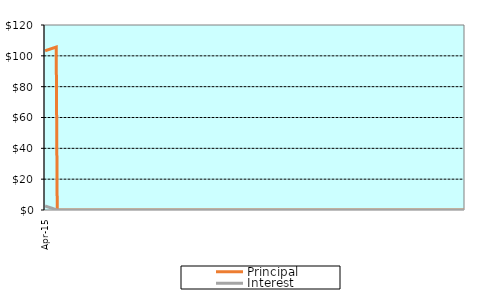
| Category | Principal | Interest |
|---|---|---|
| 42095 | 103.31 | 2.61 |
| 42125 | 103.35 | 2.57 |
| 42156 | 103.39 | 2.53 |
| 42186 | 103.43 | 2.49 |
| 42217 | 103.48 | 2.44 |
| 42248 | 103.52 | 2.4 |
| 42278 | 103.56 | 2.36 |
| 42309 | 103.61 | 2.31 |
| 42339 | 103.65 | 2.27 |
| 42370 | 103.69 | 2.23 |
| 42401 | 103.74 | 2.18 |
| 42430 | 103.78 | 2.14 |
| 42461 | 103.82 | 2.1 |
| 42491 | 103.87 | 2.05 |
| 42522 | 103.91 | 2.01 |
| 42552 | 103.95 | 1.97 |
| 42583 | 104 | 1.92 |
| 42614 | 104.04 | 1.88 |
| 42644 | 104.08 | 1.84 |
| 42675 | 104.13 | 1.79 |
| 42705 | 104.17 | 1.75 |
| 42736 | 104.21 | 1.71 |
| 42767 | 104.26 | 1.66 |
| 42795 | 104.3 | 1.62 |
| 42826 | 104.34 | 1.58 |
| 42856 | 104.39 | 1.53 |
| 42887 | 104.43 | 1.49 |
| 42917 | 104.47 | 1.45 |
| 42948 | 104.52 | 1.4 |
| 42979 | 104.56 | 1.36 |
| 43009 | 104.6 | 1.32 |
| 43040 | 104.65 | 1.27 |
| 43070 | 104.69 | 1.23 |
| 43101 | 104.74 | 1.18 |
| 43132 | 104.78 | 1.14 |
| 43160 | 104.82 | 1.1 |
| 43191 | 104.87 | 1.05 |
| 43221 | 104.91 | 1.01 |
| 43252 | 104.95 | 0.97 |
| 43282 | 105 | 0.92 |
| 43313 | 105.04 | 0.88 |
| 43344 | 105.09 | 0.83 |
| 43374 | 105.13 | 0.79 |
| 43405 | 105.17 | 0.75 |
| 43435 | 105.22 | 0.7 |
| 43466 | 105.26 | 0.66 |
| 43497 | 105.3 | 0.62 |
| 43525 | 105.35 | 0.57 |
| 43556 | 105.39 | 0.53 |
| 43586 | 105.44 | 0.48 |
| 43617 | 105.48 | 0.44 |
| 43647 | 105.52 | 0.4 |
| 43678 | 105.57 | 0.35 |
| 43709 | 105.61 | 0.31 |
| 43739 | 105.66 | 0.26 |
| 43770 | 105.7 | 0.22 |
| 43800 | 105.74 | 0.18 |
| 43831 | 105.79 | 0.13 |
| 43862 | 105.83 | 0.09 |
| 43891 | 105.74 | 0.04 |
|  | 0 | 0 |
|  | 0 | 0 |
|  | 0 | 0 |
|  | 0 | 0 |
|  | 0 | 0 |
|  | 0 | 0 |
|  | 0 | 0 |
|  | 0 | 0 |
|  | 0 | 0 |
|  | 0 | 0 |
|  | 0 | 0 |
|  | 0 | 0 |
|  | 0 | 0 |
|  | 0 | 0 |
|  | 0 | 0 |
|  | 0 | 0 |
|  | 0 | 0 |
|  | 0 | 0 |
|  | 0 | 0 |
|  | 0 | 0 |
|  | 0 | 0 |
|  | 0 | 0 |
|  | 0 | 0 |
|  | 0 | 0 |
|  | 0 | 0 |
|  | 0 | 0 |
|  | 0 | 0 |
|  | 0 | 0 |
|  | 0 | 0 |
|  | 0 | 0 |
|  | 0 | 0 |
|  | 0 | 0 |
|  | 0 | 0 |
|  | 0 | 0 |
|  | 0 | 0 |
|  | 0 | 0 |
|  | 0 | 0 |
|  | 0 | 0 |
|  | 0 | 0 |
|  | 0 | 0 |
|  | 0 | 0 |
|  | 0 | 0 |
|  | 0 | 0 |
|  | 0 | 0 |
|  | 0 | 0 |
|  | 0 | 0 |
|  | 0 | 0 |
|  | 0 | 0 |
|  | 0 | 0 |
|  | 0 | 0 |
|  | 0 | 0 |
|  | 0 | 0 |
|  | 0 | 0 |
|  | 0 | 0 |
|  | 0 | 0 |
|  | 0 | 0 |
|  | 0 | 0 |
|  | 0 | 0 |
|  | 0 | 0 |
|  | 0 | 0 |
|  | 0 | 0 |
|  | 0 | 0 |
|  | 0 | 0 |
|  | 0 | 0 |
|  | 0 | 0 |
|  | 0 | 0 |
|  | 0 | 0 |
|  | 0 | 0 |
|  | 0 | 0 |
|  | 0 | 0 |
|  | 0 | 0 |
|  | 0 | 0 |
|  | 0 | 0 |
|  | 0 | 0 |
|  | 0 | 0 |
|  | 0 | 0 |
|  | 0 | 0 |
|  | 0 | 0 |
|  | 0 | 0 |
|  | 0 | 0 |
|  | 0 | 0 |
|  | 0 | 0 |
|  | 0 | 0 |
|  | 0 | 0 |
|  | 0 | 0 |
|  | 0 | 0 |
|  | 0 | 0 |
|  | 0 | 0 |
|  | 0 | 0 |
|  | 0 | 0 |
|  | 0 | 0 |
|  | 0 | 0 |
|  | 0 | 0 |
|  | 0 | 0 |
|  | 0 | 0 |
|  | 0 | 0 |
|  | 0 | 0 |
|  | 0 | 0 |
|  | 0 | 0 |
|  | 0 | 0 |
|  | 0 | 0 |
|  | 0 | 0 |
|  | 0 | 0 |
|  | 0 | 0 |
|  | 0 | 0 |
|  | 0 | 0 |
|  | 0 | 0 |
|  | 0 | 0 |
|  | 0 | 0 |
|  | 0 | 0 |
|  | 0 | 0 |
|  | 0 | 0 |
|  | 0 | 0 |
|  | 0 | 0 |
|  | 0 | 0 |
|  | 0 | 0 |
|  | 0 | 0 |
|  | 0 | 0 |
|  | 0 | 0 |
|  | 0 | 0 |
|  | 0 | 0 |
|  | 0 | 0 |
|  | 0 | 0 |
|  | 0 | 0 |
|  | 0 | 0 |
|  | 0 | 0 |
|  | 0 | 0 |
|  | 0 | 0 |
|  | 0 | 0 |
|  | 0 | 0 |
|  | 0 | 0 |
|  | 0 | 0 |
|  | 0 | 0 |
|  | 0 | 0 |
|  | 0 | 0 |
|  | 0 | 0 |
|  | 0 | 0 |
|  | 0 | 0 |
|  | 0 | 0 |
|  | 0 | 0 |
|  | 0 | 0 |
|  | 0 | 0 |
|  | 0 | 0 |
|  | 0 | 0 |
|  | 0 | 0 |
|  | 0 | 0 |
|  | 0 | 0 |
|  | 0 | 0 |
|  | 0 | 0 |
|  | 0 | 0 |
|  | 0 | 0 |
|  | 0 | 0 |
|  | 0 | 0 |
|  | 0 | 0 |
|  | 0 | 0 |
|  | 0 | 0 |
|  | 0 | 0 |
|  | 0 | 0 |
|  | 0 | 0 |
|  | 0 | 0 |
|  | 0 | 0 |
|  | 0 | 0 |
|  | 0 | 0 |
|  | 0 | 0 |
|  | 0 | 0 |
|  | 0 | 0 |
|  | 0 | 0 |
|  | 0 | 0 |
|  | 0 | 0 |
|  | 0 | 0 |
|  | 0 | 0 |
|  | 0 | 0 |
|  | 0 | 0 |
|  | 0 | 0 |
|  | 0 | 0 |
|  | 0 | 0 |
|  | 0 | 0 |
|  | 0 | 0 |
|  | 0 | 0 |
|  | 0 | 0 |
|  | 0 | 0 |
|  | 0 | 0 |
|  | 0 | 0 |
|  | 0 | 0 |
|  | 0 | 0 |
|  | 0 | 0 |
|  | 0 | 0 |
|  | 0 | 0 |
|  | 0 | 0 |
|  | 0 | 0 |
|  | 0 | 0 |
|  | 0 | 0 |
|  | 0 | 0 |
|  | 0 | 0 |
|  | 0 | 0 |
|  | 0 | 0 |
|  | 0 | 0 |
|  | 0 | 0 |
|  | 0 | 0 |
|  | 0 | 0 |
|  | 0 | 0 |
|  | 0 | 0 |
|  | 0 | 0 |
|  | 0 | 0 |
|  | 0 | 0 |
|  | 0 | 0 |
|  | 0 | 0 |
|  | 0 | 0 |
|  | 0 | 0 |
|  | 0 | 0 |
|  | 0 | 0 |
|  | 0 | 0 |
|  | 0 | 0 |
|  | 0 | 0 |
|  | 0 | 0 |
|  | 0 | 0 |
|  | 0 | 0 |
|  | 0 | 0 |
|  | 0 | 0 |
|  | 0 | 0 |
|  | 0 | 0 |
|  | 0 | 0 |
|  | 0 | 0 |
|  | 0 | 0 |
|  | 0 | 0 |
|  | 0 | 0 |
|  | 0 | 0 |
|  | 0 | 0 |
|  | 0 | 0 |
|  | 0 | 0 |
|  | 0 | 0 |
|  | 0 | 0 |
|  | 0 | 0 |
|  | 0 | 0 |
|  | 0 | 0 |
|  | 0 | 0 |
|  | 0 | 0 |
|  | 0 | 0 |
|  | 0 | 0 |
|  | 0 | 0 |
|  | 0 | 0 |
|  | 0 | 0 |
|  | 0 | 0 |
|  | 0 | 0 |
|  | 0 | 0 |
|  | 0 | 0 |
|  | 0 | 0 |
|  | 0 | 0 |
|  | 0 | 0 |
|  | 0 | 0 |
|  | 0 | 0 |
|  | 0 | 0 |
|  | 0 | 0 |
|  | 0 | 0 |
|  | 0 | 0 |
|  | 0 | 0 |
|  | 0 | 0 |
|  | 0 | 0 |
|  | 0 | 0 |
|  | 0 | 0 |
|  | 0 | 0 |
|  | 0 | 0 |
|  | 0 | 0 |
|  | 0 | 0 |
|  | 0 | 0 |
|  | 0 | 0 |
|  | 0 | 0 |
|  | 0 | 0 |
|  | 0 | 0 |
|  | 0 | 0 |
|  | 0 | 0 |
|  | 0 | 0 |
|  | 0 | 0 |
|  | 0 | 0 |
|  | 0 | 0 |
|  | 0 | 0 |
|  | 0 | 0 |
|  | 0 | 0 |
|  | 0 | 0 |
|  | 0 | 0 |
|  | 0 | 0 |
|  | 0 | 0 |
|  | 0 | 0 |
|  | 0 | 0 |
|  | 0 | 0 |
|  | 0 | 0 |
|  | 0 | 0 |
|  | 0 | 0 |
|  | 0 | 0 |
|  | 0 | 0 |
|  | 0 | 0 |
|  | 0 | 0 |
|  | 0 | 0 |
|  | 0 | 0 |
|  | 0 | 0 |
|  | 0 | 0 |
|  | 0 | 0 |
|  | 0 | 0 |
|  | 0 | 0 |
|  | 0 | 0 |
|  | 0 | 0 |
|  | 0 | 0 |
|  | 0 | 0 |
|  | 0 | 0 |
|  | 0 | 0 |
|  | 0 | 0 |
|  | 0 | 0 |
|  | 0 | 0 |
|  | 0 | 0 |
|  | 0 | 0 |
|  | 0 | 0 |
|  | 0 | 0 |
|  | 0 | 0 |
|  | 0 | 0 |
|  | 0 | 0 |
|  | 0 | 0 |
|  | 0 | 0 |
|  | 0 | 0 |
|  | 0 | 0 |
|  | 0 | 0 |
|  | 0 | 0 |
|  | 0 | 0 |
|  | 0 | 0 |
|  | 0 | 0 |
|  | 0 | 0 |
|  | 0 | 0 |
|  | 0 | 0 |
|  | 0 | 0 |
|  | 0 | 0 |
|  | 0 | 0 |
|  | 0 | 0 |
|  | 0 | 0 |
|  | 0 | 0 |
|  | 0 | 0 |
|  | 0 | 0 |
|  | 0 | 0 |
|  | 0 | 0 |
|  | 0 | 0 |
|  | 0 | 0 |
|  | 0 | 0 |
|  | 0 | 0 |
|  | 0 | 0 |
|  | 0 | 0 |
|  | 0 | 0 |
|  | 0 | 0 |
|  | 0 | 0 |
|  | 0 | 0 |
|  | 0 | 0 |
|  | 0 | 0 |
|  | 0 | 0 |
|  | 0 | 0 |
|  | 0 | 0 |
|  | 0 | 0 |
|  | 0 | 0 |
|  | 0 | 0 |
|  | 0 | 0 |
|  | 0 | 0 |
|  | 0 | 0 |
|  | 0 | 0 |
|  | 0 | 0 |
|  | 0 | 0 |
|  | 0 | 0 |
|  | 0 | 0 |
|  | 0 | 0 |
|  | 0 | 0 |
|  | 0 | 0 |
|  | 0 | 0 |
|  | 0 | 0 |
|  | 0 | 0 |
|  | 0 | 0 |
|  | 0 | 0 |
|  | 0 | 0 |
|  | 0 | 0 |
|  | 0 | 0 |
|  | 0 | 0 |
|  | 0 | 0 |
|  | 0 | 0 |
|  | 0 | 0 |
|  | 0 | 0 |
|  | 0 | 0 |
|  | 0 | 0 |
|  | 0 | 0 |
|  | 0 | 0 |
|  | 0 | 0 |
|  | 0 | 0 |
|  | 0 | 0 |
|  | 0 | 0 |
|  | 0 | 0 |
|  | 0 | 0 |
|  | 0 | 0 |
|  | 0 | 0 |
|  | 0 | 0 |
|  | 0 | 0 |
|  | 0 | 0 |
|  | 0 | 0 |
|  | 0 | 0 |
|  | 0 | 0 |
|  | 0 | 0 |
|  | 0 | 0 |
|  | 0 | 0 |
|  | 0 | 0 |
|  | 0 | 0 |
|  | 0 | 0 |
|  | 0 | 0 |
|  | 0 | 0 |
|  | 0 | 0 |
|  | 0 | 0 |
|  | 0 | 0 |
|  | 0 | 0 |
|  | 0 | 0 |
|  | 0 | 0 |
|  | 0 | 0 |
|  | 0 | 0 |
|  | 0 | 0 |
|  | 0 | 0 |
|  | 0 | 0 |
|  | 0 | 0 |
|  | 0 | 0 |
|  | 0 | 0 |
|  | 0 | 0 |
|  | 0 | 0 |
|  | 0 | 0 |
|  | 0 | 0 |
|  | 0 | 0 |
|  | 0 | 0 |
|  | 0 | 0 |
|  | 0 | 0 |
|  | 0 | 0 |
|  | 0 | 0 |
|  | 0 | 0 |
|  | 0 | 0 |
|  | 0 | 0 |
|  | 0 | 0 |
|  | 0 | 0 |
|  | 0 | 0 |
|  | 0 | 0 |
|  | 0 | 0 |
|  | 0 | 0 |
|  | 0 | 0 |
|  | 0 | 0 |
|  | 0 | 0 |
|  | 0 | 0 |
|  | 0 | 0 |
|  | 0 | 0 |
|  | 0 | 0 |
|  | 0 | 0 |
|  | 0 | 0 |
|  | 0 | 0 |
|  | 0 | 0 |
|  | 0 | 0 |
|  | 0 | 0 |
|  | 0 | 0 |
|  | 0 | 0 |
|  | 0 | 0 |
|  | 0 | 0 |
|  | 0 | 0 |
|  | 0 | 0 |
|  | 0 | 0 |
|  | 0 | 0 |
|  | 0 | 0 |
|  | 0 | 0 |
|  | 0 | 0 |
|  | 0 | 0 |
|  | 0 | 0 |
|  | 0 | 0 |
|  | 0 | 0 |
|  | 0 | 0 |
|  | 0 | 0 |
|  | 0 | 0 |
|  | 0 | 0 |
|  | 0 | 0 |
|  | 0 | 0 |
|  | 0 | 0 |
|  | 0 | 0 |
|  | 0 | 0 |
|  | 0 | 0 |
|  | 0 | 0 |
|  | 0 | 0 |
|  | 0 | 0 |
|  | 0 | 0 |
|  | 0 | 0 |
|  | 0 | 0 |
|  | 0 | 0 |
|  | 0 | 0 |
|  | 0 | 0 |
|  | 0 | 0 |
|  | 0 | 0 |
|  | 0 | 0 |
|  | 0 | 0 |
|  | 0 | 0 |
|  | 0 | 0 |
|  | 0 | 0 |
|  | 0 | 0 |
|  | 0 | 0 |
|  | 0 | 0 |
|  | 0 | 0 |
|  | 0 | 0 |
|  | 0 | 0 |
|  | 0 | 0 |
|  | 0 | 0 |
|  | 0 | 0 |
|  | 0 | 0 |
|  | 0 | 0 |
|  | 0 | 0 |
|  | 0 | 0 |
|  | 0 | 0 |
|  | 0 | 0 |
|  | 0 | 0 |
|  | 0 | 0 |
|  | 0 | 0 |
|  | 0 | 0 |
|  | 0 | 0 |
|  | 0 | 0 |
|  | 0 | 0 |
|  | 0 | 0 |
|  | 0 | 0 |
|  | 0 | 0 |
|  | 0 | 0 |
|  | 0 | 0 |
|  | 0 | 0 |
|  | 0 | 0 |
|  | 0 | 0 |
|  | 0 | 0 |
|  | 0 | 0 |
|  | 0 | 0 |
|  | 0 | 0 |
|  | 0 | 0 |
|  | 0 | 0 |
|  | 0 | 0 |
|  | 0 | 0 |
|  | 0 | 0 |
|  | 0 | 0 |
|  | 0 | 0 |
|  | 0 | 0 |
|  | 0 | 0 |
|  | 0 | 0 |
|  | 0 | 0 |
|  | 0 | 0 |
|  | 0 | 0 |
|  | 0 | 0 |
|  | 0 | 0 |
|  | 0 | 0 |
|  | 0 | 0 |
|  | 0 | 0 |
|  | 0 | 0 |
|  | 0 | 0 |
|  | 0 | 0 |
|  | 0 | 0 |
|  | 0 | 0 |
|  | 0 | 0 |
|  | 0 | 0 |
|  | 0 | 0 |
|  | 0 | 0 |
|  | 0 | 0 |
|  | 0 | 0 |
|  | 0 | 0 |
|  | 0 | 0 |
|  | 0 | 0 |
|  | 0 | 0 |
|  | 0 | 0 |
|  | 0 | 0 |
|  | 0 | 0 |
|  | 0 | 0 |
|  | 0 | 0 |
|  | 0 | 0 |
|  | 0 | 0 |
|  | 0 | 0 |
|  | 0 | 0 |
|  | 0 | 0 |
|  | 0 | 0 |
|  | 0 | 0 |
|  | 0 | 0 |
|  | 0 | 0 |
|  | 0 | 0 |
|  | 0 | 0 |
|  | 0 | 0 |
|  | 0 | 0 |
|  | 0 | 0 |
|  | 0 | 0 |
|  | 0 | 0 |
|  | 0 | 0 |
|  | 0 | 0 |
|  | 0 | 0 |
|  | 0 | 0 |
|  | 0 | 0 |
|  | 0 | 0 |
|  | 0 | 0 |
|  | 0 | 0 |
|  | 0 | 0 |
|  | 0 | 0 |
|  | 0 | 0 |
|  | 0 | 0 |
|  | 0 | 0 |
|  | 0 | 0 |
|  | 0 | 0 |
|  | 0 | 0 |
|  | 0 | 0 |
|  | 0 | 0 |
|  | 0 | 0 |
|  | 0 | 0 |
|  | 0 | 0 |
|  | 0 | 0 |
|  | 0 | 0 |
|  | 0 | 0 |
|  | 0 | 0 |
|  | 0 | 0 |
|  | 0 | 0 |
|  | 0 | 0 |
|  | 0 | 0 |
|  | 0 | 0 |
|  | 0 | 0 |
|  | 0 | 0 |
|  | 0 | 0 |
|  | 0 | 0 |
|  | 0 | 0 |
|  | 0 | 0 |
|  | 0 | 0 |
|  | 0 | 0 |
|  | 0 | 0 |
|  | 0 | 0 |
|  | 0 | 0 |
|  | 0 | 0 |
|  | 0 | 0 |
|  | 0 | 0 |
|  | 0 | 0 |
|  | 0 | 0 |
|  | 0 | 0 |
|  | 0 | 0 |
|  | 0 | 0 |
|  | 0 | 0 |
|  | 0 | 0 |
|  | 0 | 0 |
|  | 0 | 0 |
|  | 0 | 0 |
|  | 0 | 0 |
|  | 0 | 0 |
|  | 0 | 0 |
|  | 0 | 0 |
|  | 0 | 0 |
|  | 0 | 0 |
|  | 0 | 0 |
|  | 0 | 0 |
|  | 0 | 0 |
|  | 0 | 0 |
|  | 0 | 0 |
|  | 0 | 0 |
|  | 0 | 0 |
|  | 0 | 0 |
|  | 0 | 0 |
|  | 0 | 0 |
|  | 0 | 0 |
|  | 0 | 0 |
|  | 0 | 0 |
|  | 0 | 0 |
|  | 0 | 0 |
|  | 0 | 0 |
|  | 0 | 0 |
|  | 0 | 0 |
|  | 0 | 0 |
|  | 0 | 0 |
|  | 0 | 0 |
|  | 0 | 0 |
|  | 0 | 0 |
|  | 0 | 0 |
|  | 0 | 0 |
|  | 0 | 0 |
|  | 0 | 0 |
|  | 0 | 0 |
|  | 0 | 0 |
|  | 0 | 0 |
|  | 0 | 0 |
|  | 0 | 0 |
|  | 0 | 0 |
|  | 0 | 0 |
|  | 0 | 0 |
|  | 0 | 0 |
|  | 0 | 0 |
|  | 0 | 0 |
|  | 0 | 0 |
|  | 0 | 0 |
|  | 0 | 0 |
|  | 0 | 0 |
|  | 0 | 0 |
|  | 0 | 0 |
|  | 0 | 0 |
|  | 0 | 0 |
|  | 0 | 0 |
|  | 0 | 0 |
|  | 0 | 0 |
|  | 0 | 0 |
|  | 0 | 0 |
|  | 0 | 0 |
|  | 0 | 0 |
|  | 0 | 0 |
|  | 0 | 0 |
|  | 0 | 0 |
|  | 0 | 0 |
|  | 0 | 0 |
|  | 0 | 0 |
|  | 0 | 0 |
|  | 0 | 0 |
|  | 0 | 0 |
|  | 0 | 0 |
|  | 0 | 0 |
|  | 0 | 0 |
|  | 0 | 0 |
|  | 0 | 0 |
|  | 0 | 0 |
|  | 0 | 0 |
|  | 0 | 0 |
|  | 0 | 0 |
|  | 0 | 0 |
|  | 0 | 0 |
|  | 0 | 0 |
|  | 0 | 0 |
|  | 0 | 0 |
|  | 0 | 0 |
|  | 0 | 0 |
|  | 0 | 0 |
|  | 0 | 0 |
|  | 0 | 0 |
|  | 0 | 0 |
|  | 0 | 0 |
|  | 0 | 0 |
|  | 0 | 0 |
|  | 0 | 0 |
|  | 0 | 0 |
|  | 0 | 0 |
|  | 0 | 0 |
|  | 0 | 0 |
|  | 0 | 0 |
|  | 0 | 0 |
|  | 0 | 0 |
|  | 0 | 0 |
|  | 0 | 0 |
|  | 0 | 0 |
|  | 0 | 0 |
|  | 0 | 0 |
|  | 0 | 0 |
|  | 0 | 0 |
|  | 0 | 0 |
|  | 0 | 0 |
|  | 0 | 0 |
|  | 0 | 0 |
|  | 0 | 0 |
|  | 0 | 0 |
|  | 0 | 0 |
|  | 0 | 0 |
|  | 0 | 0 |
|  | 0 | 0 |
|  | 0 | 0 |
|  | 0 | 0 |
|  | 0 | 0 |
|  | 0 | 0 |
|  | 0 | 0 |
|  | 0 | 0 |
|  | 0 | 0 |
|  | 0 | 0 |
|  | 0 | 0 |
|  | 0 | 0 |
|  | 0 | 0 |
|  | 0 | 0 |
|  | 0 | 0 |
|  | 0 | 0 |
|  | 0 | 0 |
|  | 0 | 0 |
|  | 0 | 0 |
|  | 0 | 0 |
|  | 0 | 0 |
|  | 0 | 0 |
|  | 0 | 0 |
|  | 0 | 0 |
|  | 0 | 0 |
|  | 0 | 0 |
|  | 0 | 0 |
|  | 0 | 0 |
|  | 0 | 0 |
|  | 0 | 0 |
|  | 0 | 0 |
|  | 0 | 0 |
|  | 0 | 0 |
|  | 0 | 0 |
|  | 0 | 0 |
|  | 0 | 0 |
|  | 0 | 0 |
|  | 0 | 0 |
|  | 0 | 0 |
|  | 0 | 0 |
|  | 0 | 0 |
|  | 0 | 0 |
|  | 0 | 0 |
|  | 0 | 0 |
|  | 0 | 0 |
|  | 0 | 0 |
|  | 0 | 0 |
|  | 0 | 0 |
|  | 0 | 0 |
|  | 0 | 0 |
|  | 0 | 0 |
|  | 0 | 0 |
|  | 0 | 0 |
|  | 0 | 0 |
|  | 0 | 0 |
|  | 0 | 0 |
|  | 0 | 0 |
|  | 0 | 0 |
|  | 0 | 0 |
|  | 0 | 0 |
|  | 0 | 0 |
|  | 0 | 0 |
|  | 0 | 0 |
|  | 0 | 0 |
|  | 0 | 0 |
|  | 0 | 0 |
|  | 0 | 0 |
|  | 0 | 0 |
|  | 0 | 0 |
|  | 0 | 0 |
|  | 0 | 0 |
|  | 0 | 0 |
|  | 0 | 0 |
|  | 0 | 0 |
|  | 0 | 0 |
|  | 0 | 0 |
|  | 0 | 0 |
|  | 0 | 0 |
|  | 0 | 0 |
|  | 0 | 0 |
|  | 0 | 0 |
|  | 0 | 0 |
|  | 0 | 0 |
|  | 0 | 0 |
|  | 0 | 0 |
|  | 0 | 0 |
|  | 0 | 0 |
|  | 0 | 0 |
|  | 0 | 0 |
|  | 0 | 0 |
|  | 0 | 0 |
|  | 0 | 0 |
|  | 0 | 0 |
|  | 0 | 0 |
|  | 0 | 0 |
|  | 0 | 0 |
|  | 0 | 0 |
|  | 0 | 0 |
|  | 0 | 0 |
|  | 0 | 0 |
|  | 0 | 0 |
|  | 0 | 0 |
|  | 0 | 0 |
|  | 0 | 0 |
|  | 0 | 0 |
|  | 0 | 0 |
|  | 0 | 0 |
|  | 0 | 0 |
|  | 0 | 0 |
|  | 0 | 0 |
|  | 0 | 0 |
|  | 0 | 0 |
|  | 0 | 0 |
|  | 0 | 0 |
|  | 0 | 0 |
|  | 0 | 0 |
|  | 0 | 0 |
|  | 0 | 0 |
|  | 0 | 0 |
|  | 0 | 0 |
|  | 0 | 0 |
|  | 0 | 0 |
|  | 0 | 0 |
|  | 0 | 0 |
|  | 0 | 0 |
|  | 0 | 0 |
|  | 0 | 0 |
|  | 0 | 0 |
|  | 0 | 0 |
|  | 0 | 0 |
|  | 0 | 0 |
|  | 0 | 0 |
|  | 0 | 0 |
|  | 0 | 0 |
|  | 0 | 0 |
|  | 0 | 0 |
|  | 0 | 0 |
|  | 0 | 0 |
|  | 0 | 0 |
|  | 0 | 0 |
|  | 0 | 0 |
|  | 0 | 0 |
|  | 0 | 0 |
|  | 0 | 0 |
|  | 0 | 0 |
|  | 0 | 0 |
|  | 0 | 0 |
|  | 0 | 0 |
|  | 0 | 0 |
|  | 0 | 0 |
|  | 0 | 0 |
|  | 0 | 0 |
|  | 0 | 0 |
|  | 0 | 0 |
|  | 0 | 0 |
|  | 0 | 0 |
|  | 0 | 0 |
|  | 0 | 0 |
|  | 0 | 0 |
|  | 0 | 0 |
|  | 0 | 0 |
|  | 0 | 0 |
|  | 0 | 0 |
|  | 0 | 0 |
|  | 0 | 0 |
|  | 0 | 0 |
|  | 0 | 0 |
|  | 0 | 0 |
|  | 0 | 0 |
|  | 0 | 0 |
|  | 0 | 0 |
|  | 0 | 0 |
|  | 0 | 0 |
|  | 0 | 0 |
|  | 0 | 0 |
|  | 0 | 0 |
|  | 0 | 0 |
|  | 0 | 0 |
|  | 0 | 0 |
|  | 0 | 0 |
|  | 0 | 0 |
|  | 0 | 0 |
|  | 0 | 0 |
|  | 0 | 0 |
|  | 0 | 0 |
|  | 0 | 0 |
|  | 0 | 0 |
|  | 0 | 0 |
|  | 0 | 0 |
|  | 0 | 0 |
|  | 0 | 0 |
|  | 0 | 0 |
|  | 0 | 0 |
|  | 0 | 0 |
|  | 0 | 0 |
|  | 0 | 0 |
|  | 0 | 0 |
|  | 0 | 0 |
|  | 0 | 0 |
|  | 0 | 0 |
|  | 0 | 0 |
|  | 0 | 0 |
|  | 0 | 0 |
|  | 0 | 0 |
|  | 0 | 0 |
|  | 0 | 0 |
|  | 0 | 0 |
|  | 0 | 0 |
|  | 0 | 0 |
|  | 0 | 0 |
|  | 0 | 0 |
|  | 0 | 0 |
|  | 0 | 0 |
|  | 0 | 0 |
|  | 0 | 0 |
|  | 0 | 0 |
|  | 0 | 0 |
|  | 0 | 0 |
|  | 0 | 0 |
|  | 0 | 0 |
|  | 0 | 0 |
|  | 0 | 0 |
|  | 0 | 0 |
|  | 0 | 0 |
|  | 0 | 0 |
|  | 0 | 0 |
|  | 0 | 0 |
|  | 0 | 0 |
|  | 0 | 0 |
|  | 0 | 0 |
|  | 0 | 0 |
|  | 0 | 0 |
|  | 0 | 0 |
|  | 0 | 0 |
|  | 0 | 0 |
|  | 0 | 0 |
|  | 0 | 0 |
|  | 0 | 0 |
|  | 0 | 0 |
|  | 0 | 0 |
|  | 0 | 0 |
|  | 0 | 0 |
|  | 0 | 0 |
|  | 0 | 0 |
|  | 0 | 0 |
|  | 0 | 0 |
|  | 0 | 0 |
|  | 0 | 0 |
|  | 0 | 0 |
|  | 0 | 0 |
|  | 0 | 0 |
|  | 0 | 0 |
|  | 0 | 0 |
|  | 0 | 0 |
|  | 0 | 0 |
|  | 0 | 0 |
|  | 0 | 0 |
|  | 0 | 0 |
|  | 0 | 0 |
|  | 0 | 0 |
|  | 0 | 0 |
|  | 0 | 0 |
|  | 0 | 0 |
|  | 0 | 0 |
|  | 0 | 0 |
|  | 0 | 0 |
|  | 0 | 0 |
|  | 0 | 0 |
|  | 0 | 0 |
|  | 0 | 0 |
|  | 0 | 0 |
|  | 0 | 0 |
|  | 0 | 0 |
|  | 0 | 0 |
|  | 0 | 0 |
|  | 0 | 0 |
|  | 0 | 0 |
|  | 0 | 0 |
|  | 0 | 0 |
|  | 0 | 0 |
|  | 0 | 0 |
|  | 0 | 0 |
|  | 0 | 0 |
|  | 0 | 0 |
|  | 0 | 0 |
|  | 0 | 0 |
|  | 0 | 0 |
|  | 0 | 0 |
|  | 0 | 0 |
|  | 0 | 0 |
|  | 0 | 0 |
|  | 0 | 0 |
|  | 0 | 0 |
|  | 0 | 0 |
|  | 0 | 0 |
|  | 0 | 0 |
|  | 0 | 0 |
|  | 0 | 0 |
|  | 0 | 0 |
|  | 0 | 0 |
|  | 0 | 0 |
|  | 0 | 0 |
|  | 0 | 0 |
|  | 0 | 0 |
|  | 0 | 0 |
|  | 0 | 0 |
|  | 0 | 0 |
|  | 0 | 0 |
|  | 0 | 0 |
|  | 0 | 0 |
|  | 0 | 0 |
|  | 0 | 0 |
|  | 0 | 0 |
|  | 0 | 0 |
|  | 0 | 0 |
|  | 0 | 0 |
|  | 0 | 0 |
|  | 0 | 0 |
|  | 0 | 0 |
|  | 0 | 0 |
|  | 0 | 0 |
|  | 0 | 0 |
|  | 0 | 0 |
|  | 0 | 0 |
|  | 0 | 0 |
|  | 0 | 0 |
|  | 0 | 0 |
|  | 0 | 0 |
|  | 0 | 0 |
|  | 0 | 0 |
|  | 0 | 0 |
|  | 0 | 0 |
|  | 0 | 0 |
|  | 0 | 0 |
|  | 0 | 0 |
|  | 0 | 0 |
|  | 0 | 0 |
|  | 0 | 0 |
|  | 0 | 0 |
|  | 0 | 0 |
|  | 0 | 0 |
|  | 0 | 0 |
|  | 0 | 0 |
|  | 0 | 0 |
|  | 0 | 0 |
|  | 0 | 0 |
|  | 0 | 0 |
|  | 0 | 0 |
|  | 0 | 0 |
|  | 0 | 0 |
|  | 0 | 0 |
|  | 0 | 0 |
|  | 0 | 0 |
|  | 0 | 0 |
|  | 0 | 0 |
|  | 0 | 0 |
|  | 0 | 0 |
|  | 0 | 0 |
|  | 0 | 0 |
|  | 0 | 0 |
|  | 0 | 0 |
|  | 0 | 0 |
|  | 0 | 0 |
|  | 0 | 0 |
|  | 0 | 0 |
|  | 0 | 0 |
|  | 0 | 0 |
|  | 0 | 0 |
|  | 0 | 0 |
|  | 0 | 0 |
|  | 0 | 0 |
|  | 0 | 0 |
|  | 0 | 0 |
|  | 0 | 0 |
|  | 0 | 0 |
|  | 0 | 0 |
|  | 0 | 0 |
|  | 0 | 0 |
|  | 0 | 0 |
|  | 0 | 0 |
|  | 0 | 0 |
|  | 0 | 0 |
|  | 0 | 0 |
|  | 0 | 0 |
|  | 0 | 0 |
|  | 0 | 0 |
|  | 0 | 0 |
|  | 0 | 0 |
|  | 0 | 0 |
|  | 0 | 0 |
|  | 0 | 0 |
|  | 0 | 0 |
|  | 0 | 0 |
|  | 0 | 0 |
|  | 0 | 0 |
|  | 0 | 0 |
|  | 0 | 0 |
|  | 0 | 0 |
|  | 0 | 0 |
|  | 0 | 0 |
|  | 0 | 0 |
|  | 0 | 0 |
|  | 0 | 0 |
|  | 0 | 0 |
|  | 0 | 0 |
|  | 0 | 0 |
|  | 0 | 0 |
|  | 0 | 0 |
|  | 0 | 0 |
|  | 0 | 0 |
|  | 0 | 0 |
|  | 0 | 0 |
|  | 0 | 0 |
|  | 0 | 0 |
|  | 0 | 0 |
|  | 0 | 0 |
|  | 0 | 0 |
|  | 0 | 0 |
|  | 0 | 0 |
|  | 0 | 0 |
|  | 0 | 0 |
|  | 0 | 0 |
|  | 0 | 0 |
|  | 0 | 0 |
|  | 0 | 0 |
|  | 0 | 0 |
|  | 0 | 0 |
|  | 0 | 0 |
|  | 0 | 0 |
|  | 0 | 0 |
|  | 0 | 0 |
|  | 0 | 0 |
|  | 0 | 0 |
|  | 0 | 0 |
|  | 0 | 0 |
|  | 0 | 0 |
|  | 0 | 0 |
|  | 0 | 0 |
|  | 0 | 0 |
|  | 0 | 0 |
|  | 0 | 0 |
|  | 0 | 0 |
|  | 0 | 0 |
|  | 0 | 0 |
|  | 0 | 0 |
|  | 0 | 0 |
|  | 0 | 0 |
|  | 0 | 0 |
|  | 0 | 0 |
|  | 0 | 0 |
|  | 0 | 0 |
|  | 0 | 0 |
|  | 0 | 0 |
|  | 0 | 0 |
|  | 0 | 0 |
|  | 0 | 0 |
|  | 0 | 0 |
|  | 0 | 0 |
|  | 0 | 0 |
|  | 0 | 0 |
|  | 0 | 0 |
|  | 0 | 0 |
|  | 0 | 0 |
|  | 0 | 0 |
|  | 0 | 0 |
|  | 0 | 0 |
|  | 0 | 0 |
|  | 0 | 0 |
|  | 0 | 0 |
|  | 0 | 0 |
|  | 0 | 0 |
|  | 0 | 0 |
|  | 0 | 0 |
|  | 0 | 0 |
|  | 0 | 0 |
|  | 0 | 0 |
|  | 0 | 0 |
|  | 0 | 0 |
|  | 0 | 0 |
|  | 0 | 0 |
|  | 0 | 0 |
|  | 0 | 0 |
|  | 0 | 0 |
|  | 0 | 0 |
|  | 0 | 0 |
|  | 0 | 0 |
|  | 0 | 0 |
|  | 0 | 0 |
|  | 0 | 0 |
|  | 0 | 0 |
|  | 0 | 0 |
|  | 0 | 0 |
|  | 0 | 0 |
|  | 0 | 0 |
|  | 0 | 0 |
|  | 0 | 0 |
|  | 0 | 0 |
|  | 0 | 0 |
|  | 0 | 0 |
|  | 0 | 0 |
|  | 0 | 0 |
|  | 0 | 0 |
|  | 0 | 0 |
|  | 0 | 0 |
|  | 0 | 0 |
|  | 0 | 0 |
|  | 0 | 0 |
|  | 0 | 0 |
|  | 0 | 0 |
|  | 0 | 0 |
|  | 0 | 0 |
|  | 0 | 0 |
|  | 0 | 0 |
|  | 0 | 0 |
|  | 0 | 0 |
|  | 0 | 0 |
|  | 0 | 0 |
|  | 0 | 0 |
|  | 0 | 0 |
|  | 0 | 0 |
|  | 0 | 0 |
|  | 0 | 0 |
|  | 0 | 0 |
|  | 0 | 0 |
|  | 0 | 0 |
|  | 0 | 0 |
|  | 0 | 0 |
|  | 0 | 0 |
|  | 0 | 0 |
|  | 0 | 0 |
|  | 0 | 0 |
|  | 0 | 0 |
|  | 0 | 0 |
|  | 0 | 0 |
|  | 0 | 0 |
|  | 0 | 0 |
|  | 0 | 0 |
|  | 0 | 0 |
|  | 0 | 0 |
|  | 0 | 0 |
|  | 0 | 0 |
|  | 0 | 0 |
|  | 0 | 0 |
|  | 0 | 0 |
|  | 0 | 0 |
|  | 0 | 0 |
|  | 0 | 0 |
|  | 0 | 0 |
|  | 0 | 0 |
|  | 0 | 0 |
|  | 0 | 0 |
|  | 0 | 0 |
|  | 0 | 0 |
|  | 0 | 0 |
|  | 0 | 0 |
|  | 0 | 0 |
|  | 0 | 0 |
|  | 0 | 0 |
|  | 0 | 0 |
|  | 0 | 0 |
|  | 0 | 0 |
|  | 0 | 0 |
|  | 0 | 0 |
|  | 0 | 0 |
|  | 0 | 0 |
|  | 0 | 0 |
|  | 0 | 0 |
|  | 0 | 0 |
|  | 0 | 0 |
|  | 0 | 0 |
|  | 0 | 0 |
|  | 0 | 0 |
|  | 0 | 0 |
|  | 0 | 0 |
|  | 0 | 0 |
|  | 0 | 0 |
|  | 0 | 0 |
|  | 0 | 0 |
|  | 0 | 0 |
|  | 0 | 0 |
|  | 0 | 0 |
|  | 0 | 0 |
|  | 0 | 0 |
|  | 0 | 0 |
|  | 0 | 0 |
|  | 0 | 0 |
|  | 0 | 0 |
|  | 0 | 0 |
|  | 0 | 0 |
|  | 0 | 0 |
|  | 0 | 0 |
|  | 0 | 0 |
|  | 0 | 0 |
|  | 0 | 0 |
|  | 0 | 0 |
|  | 0 | 0 |
|  | 0 | 0 |
|  | 0 | 0 |
|  | 0 | 0 |
|  | 0 | 0 |
|  | 0 | 0 |
|  | 0 | 0 |
|  | 0 | 0 |
|  | 0 | 0 |
|  | 0 | 0 |
|  | 0 | 0 |
|  | 0 | 0 |
|  | 0 | 0 |
|  | 0 | 0 |
|  | 0 | 0 |
|  | 0 | 0 |
|  | 0 | 0 |
|  | 0 | 0 |
|  | 0 | 0 |
|  | 0 | 0 |
|  | 0 | 0 |
|  | 0 | 0 |
|  | 0 | 0 |
|  | 0 | 0 |
|  | 0 | 0 |
|  | 0 | 0 |
|  | 0 | 0 |
|  | 0 | 0 |
|  | 0 | 0 |
|  | 0 | 0 |
|  | 0 | 0 |
|  | 0 | 0 |
|  | 0 | 0 |
|  | 0 | 0 |
|  | 0 | 0 |
|  | 0 | 0 |
|  | 0 | 0 |
|  | 0 | 0 |
|  | 0 | 0 |
|  | 0 | 0 |
|  | 0 | 0 |
|  | 0 | 0 |
|  | 0 | 0 |
|  | 0 | 0 |
|  | 0 | 0 |
|  | 0 | 0 |
|  | 0 | 0 |
|  | 0 | 0 |
|  | 0 | 0 |
|  | 0 | 0 |
|  | 0 | 0 |
|  | 0 | 0 |
|  | 0 | 0 |
|  | 0 | 0 |
|  | 0 | 0 |
|  | 0 | 0 |
|  | 0 | 0 |
|  | 0 | 0 |
|  | 0 | 0 |
|  | 0 | 0 |
|  | 0 | 0 |
|  | 0 | 0 |
|  | 0 | 0 |
|  | 0 | 0 |
|  | 0 | 0 |
|  | 0 | 0 |
|  | 0 | 0 |
|  | 0 | 0 |
|  | 0 | 0 |
|  | 0 | 0 |
|  | 0 | 0 |
|  | 0 | 0 |
|  | 0 | 0 |
|  | 0 | 0 |
|  | 0 | 0 |
|  | 0 | 0 |
|  | 0 | 0 |
|  | 0 | 0 |
|  | 0 | 0 |
|  | 0 | 0 |
|  | 0 | 0 |
|  | 0 | 0 |
|  | 0 | 0 |
|  | 0 | 0 |
|  | 0 | 0 |
|  | 0 | 0 |
|  | 0 | 0 |
|  | 0 | 0 |
|  | 0 | 0 |
|  | 0 | 0 |
|  | 0 | 0 |
|  | 0 | 0 |
|  | 0 | 0 |
|  | 0 | 0 |
|  | 0 | 0 |
|  | 0 | 0 |
|  | 0 | 0 |
|  | 0 | 0 |
|  | 0 | 0 |
|  | 0 | 0 |
|  | 0 | 0 |
|  | 0 | 0 |
|  | 0 | 0 |
|  | 0 | 0 |
|  | 0 | 0 |
|  | 0 | 0 |
|  | 0 | 0 |
|  | 0 | 0 |
|  | 0 | 0 |
|  | 0 | 0 |
|  | 0 | 0 |
|  | 0 | 0 |
|  | 0 | 0 |
|  | 0 | 0 |
|  | 0 | 0 |
|  | 0 | 0 |
|  | 0 | 0 |
|  | 0 | 0 |
|  | 0 | 0 |
|  | 0 | 0 |
|  | 0 | 0 |
|  | 0 | 0 |
|  | 0 | 0 |
|  | 0 | 0 |
|  | 0 | 0 |
|  | 0 | 0 |
|  | 0 | 0 |
|  | 0 | 0 |
|  | 0 | 0 |
|  | 0 | 0 |
|  | 0 | 0 |
|  | 0 | 0 |
|  | 0 | 0 |
|  | 0 | 0 |
|  | 0 | 0 |
|  | 0 | 0 |
|  | 0 | 0 |
|  | 0 | 0 |
|  | 0 | 0 |
|  | 0 | 0 |
|  | 0 | 0 |
|  | 0 | 0 |
|  | 0 | 0 |
|  | 0 | 0 |
|  | 0 | 0 |
|  | 0 | 0 |
|  | 0 | 0 |
|  | 0 | 0 |
|  | 0 | 0 |
|  | 0 | 0 |
|  | 0 | 0 |
|  | 0 | 0 |
|  | 0 | 0 |
|  | 0 | 0 |
|  | 0 | 0 |
|  | 0 | 0 |
|  | 0 | 0 |
|  | 0 | 0 |
|  | 0 | 0 |
|  | 0 | 0 |
|  | 0 | 0 |
|  | 0 | 0 |
|  | 0 | 0 |
|  | 0 | 0 |
|  | 0 | 0 |
|  | 0 | 0 |
|  | 0 | 0 |
|  | 0 | 0 |
|  | 0 | 0 |
|  | 0 | 0 |
|  | 0 | 0 |
|  | 0 | 0 |
|  | 0 | 0 |
|  | 0 | 0 |
|  | 0 | 0 |
|  | 0 | 0 |
|  | 0 | 0 |
|  | 0 | 0 |
|  | 0 | 0 |
|  | 0 | 0 |
|  | 0 | 0 |
|  | 0 | 0 |
|  | 0 | 0 |
|  | 0 | 0 |
|  | 0 | 0 |
|  | 0 | 0 |
|  | 0 | 0 |
|  | 0 | 0 |
|  | 0 | 0 |
|  | 0 | 0 |
|  | 0 | 0 |
|  | 0 | 0 |
|  | 0 | 0 |
|  | 0 | 0 |
|  | 0 | 0 |
|  | 0 | 0 |
|  | 0 | 0 |
|  | 0 | 0 |
|  | 0 | 0 |
|  | 0 | 0 |
|  | 0 | 0 |
|  | 0 | 0 |
|  | 0 | 0 |
|  | 0 | 0 |
|  | 0 | 0 |
|  | 0 | 0 |
|  | 0 | 0 |
|  | 0 | 0 |
|  | 0 | 0 |
|  | 0 | 0 |
|  | 0 | 0 |
|  | 0 | 0 |
|  | 0 | 0 |
|  | 0 | 0 |
|  | 0 | 0 |
|  | 0 | 0 |
|  | 0 | 0 |
|  | 0 | 0 |
|  | 0 | 0 |
|  | 0 | 0 |
|  | 0 | 0 |
|  | 0 | 0 |
|  | 0 | 0 |
|  | 0 | 0 |
|  | 0 | 0 |
|  | 0 | 0 |
|  | 0 | 0 |
|  | 0 | 0 |
|  | 0 | 0 |
|  | 0 | 0 |
|  | 0 | 0 |
|  | 0 | 0 |
|  | 0 | 0 |
|  | 0 | 0 |
|  | 0 | 0 |
|  | 0 | 0 |
|  | 0 | 0 |
|  | 0 | 0 |
|  | 0 | 0 |
|  | 0 | 0 |
|  | 0 | 0 |
|  | 0 | 0 |
|  | 0 | 0 |
|  | 0 | 0 |
|  | 0 | 0 |
|  | 0 | 0 |
|  | 0 | 0 |
|  | 0 | 0 |
|  | 0 | 0 |
|  | 0 | 0 |
|  | 0 | 0 |
|  | 0 | 0 |
|  | 0 | 0 |
|  | 0 | 0 |
|  | 0 | 0 |
|  | 0 | 0 |
|  | 0 | 0 |
|  | 0 | 0 |
|  | 0 | 0 |
|  | 0 | 0 |
|  | 0 | 0 |
|  | 0 | 0 |
|  | 0 | 0 |
|  | 0 | 0 |
|  | 0 | 0 |
|  | 0 | 0 |
|  | 0 | 0 |
|  | 0 | 0 |
|  | 0 | 0 |
|  | 0 | 0 |
|  | 0 | 0 |
|  | 0 | 0 |
|  | 0 | 0 |
|  | 0 | 0 |
|  | 0 | 0 |
|  | 0 | 0 |
|  | 0 | 0 |
|  | 0 | 0 |
|  | 0 | 0 |
|  | 0 | 0 |
|  | 0 | 0 |
|  | 0 | 0 |
|  | 0 | 0 |
|  | 0 | 0 |
|  | 0 | 0 |
|  | 0 | 0 |
|  | 0 | 0 |
|  | 0 | 0 |
|  | 0 | 0 |
|  | 0 | 0 |
|  | 0 | 0 |
|  | 0 | 0 |
|  | 0 | 0 |
|  | 0 | 0 |
|  | 0 | 0 |
|  | 0 | 0 |
|  | 0 | 0 |
|  | 0 | 0 |
|  | 0 | 0 |
|  | 0 | 0 |
|  | 0 | 0 |
|  | 0 | 0 |
|  | 0 | 0 |
|  | 0 | 0 |
|  | 0 | 0 |
|  | 0 | 0 |
|  | 0 | 0 |
|  | 0 | 0 |
|  | 0 | 0 |
|  | 0 | 0 |
|  | 0 | 0 |
|  | 0 | 0 |
|  | 0 | 0 |
|  | 0 | 0 |
|  | 0 | 0 |
|  | 0 | 0 |
|  | 0 | 0 |
|  | 0 | 0 |
|  | 0 | 0 |
|  | 0 | 0 |
|  | 0 | 0 |
|  | 0 | 0 |
|  | 0 | 0 |
|  | 0 | 0 |
|  | 0 | 0 |
|  | 0 | 0 |
|  | 0 | 0 |
|  | 0 | 0 |
|  | 0 | 0 |
|  | 0 | 0 |
|  | 0 | 0 |
|  | 0 | 0 |
|  | 0 | 0 |
|  | 0 | 0 |
|  | 0 | 0 |
|  | 0 | 0 |
|  | 0 | 0 |
|  | 0 | 0 |
|  | 0 | 0 |
|  | 0 | 0 |
|  | 0 | 0 |
|  | 0 | 0 |
|  | 0 | 0 |
|  | 0 | 0 |
|  | 0 | 0 |
|  | 0 | 0 |
|  | 0 | 0 |
|  | 0 | 0 |
|  | 0 | 0 |
|  | 0 | 0 |
|  | 0 | 0 |
|  | 0 | 0 |
|  | 0 | 0 |
|  | 0 | 0 |
|  | 0 | 0 |
|  | 0 | 0 |
|  | 0 | 0 |
|  | 0 | 0 |
|  | 0 | 0 |
|  | 0 | 0 |
|  | 0 | 0 |
|  | 0 | 0 |
|  | 0 | 0 |
|  | 0 | 0 |
|  | 0 | 0 |
|  | 0 | 0 |
|  | 0 | 0 |
|  | 0 | 0 |
|  | 0 | 0 |
|  | 0 | 0 |
|  | 0 | 0 |
|  | 0 | 0 |
|  | 0 | 0 |
|  | 0 | 0 |
|  | 0 | 0 |
|  | 0 | 0 |
|  | 0 | 0 |
|  | 0 | 0 |
|  | 0 | 0 |
|  | 0 | 0 |
|  | 0 | 0 |
|  | 0 | 0 |
|  | 0 | 0 |
|  | 0 | 0 |
|  | 0 | 0 |
|  | 0 | 0 |
|  | 0 | 0 |
|  | 0 | 0 |
|  | 0 | 0 |
|  | 0 | 0 |
|  | 0 | 0 |
|  | 0 | 0 |
|  | 0 | 0 |
|  | 0 | 0 |
|  | 0 | 0 |
|  | 0 | 0 |
|  | 0 | 0 |
|  | 0 | 0 |
|  | 0 | 0 |
|  | 0 | 0 |
|  | 0 | 0 |
|  | 0 | 0 |
|  | 0 | 0 |
|  | 0 | 0 |
|  | 0 | 0 |
|  | 0 | 0 |
|  | 0 | 0 |
|  | 0 | 0 |
|  | 0 | 0 |
|  | 0 | 0 |
|  | 0 | 0 |
|  | 0 | 0 |
|  | 0 | 0 |
|  | 0 | 0 |
|  | 0 | 0 |
|  | 0 | 0 |
|  | 0 | 0 |
|  | 0 | 0 |
|  | 0 | 0 |
|  | 0 | 0 |
|  | 0 | 0 |
|  | 0 | 0 |
|  | 0 | 0 |
|  | 0 | 0 |
|  | 0 | 0 |
|  | 0 | 0 |
|  | 0 | 0 |
|  | 0 | 0 |
|  | 0 | 0 |
|  | 0 | 0 |
|  | 0 | 0 |
|  | 0 | 0 |
|  | 0 | 0 |
|  | 0 | 0 |
|  | 0 | 0 |
|  | 0 | 0 |
|  | 0 | 0 |
|  | 0 | 0 |
|  | 0 | 0 |
|  | 0 | 0 |
|  | 0 | 0 |
|  | 0 | 0 |
|  | 0 | 0 |
|  | 0 | 0 |
|  | 0 | 0 |
|  | 0 | 0 |
|  | 0 | 0 |
|  | 0 | 0 |
|  | 0 | 0 |
|  | 0 | 0 |
|  | 0 | 0 |
|  | 0 | 0 |
|  | 0 | 0 |
|  | 0 | 0 |
|  | 0 | 0 |
|  | 0 | 0 |
|  | 0 | 0 |
|  | 0 | 0 |
|  | 0 | 0 |
|  | 0 | 0 |
|  | 0 | 0 |
|  | 0 | 0 |
|  | 0 | 0 |
|  | 0 | 0 |
|  | 0 | 0 |
|  | 0 | 0 |
|  | 0 | 0 |
|  | 0 | 0 |
|  | 0 | 0 |
|  | 0 | 0 |
|  | 0 | 0 |
|  | 0 | 0 |
|  | 0 | 0 |
|  | 0 | 0 |
|  | 0 | 0 |
|  | 0 | 0 |
|  | 0 | 0 |
|  | 0 | 0 |
|  | 0 | 0 |
|  | 0 | 0 |
|  | 0 | 0 |
|  | 0 | 0 |
|  | 0 | 0 |
|  | 0 | 0 |
|  | 0 | 0 |
|  | 0 | 0 |
|  | 0 | 0 |
|  | 0 | 0 |
|  | 0 | 0 |
|  | 0 | 0 |
|  | 0 | 0 |
|  | 0 | 0 |
|  | 0 | 0 |
|  | 0 | 0 |
|  | 0 | 0 |
|  | 0 | 0 |
|  | 0 | 0 |
|  | 0 | 0 |
|  | 0 | 0 |
|  | 0 | 0 |
|  | 0 | 0 |
|  | 0 | 0 |
|  | 0 | 0 |
|  | 0 | 0 |
|  | 0 | 0 |
|  | 0 | 0 |
|  | 0 | 0 |
|  | 0 | 0 |
|  | 0 | 0 |
|  | 0 | 0 |
|  | 0 | 0 |
|  | 0 | 0 |
|  | 0 | 0 |
|  | 0 | 0 |
|  | 0 | 0 |
|  | 0 | 0 |
|  | 0 | 0 |
|  | 0 | 0 |
|  | 0 | 0 |
|  | 0 | 0 |
|  | 0 | 0 |
|  | 0 | 0 |
|  | 0 | 0 |
|  | 0 | 0 |
|  | 0 | 0 |
|  | 0 | 0 |
|  | 0 | 0 |
|  | 0 | 0 |
|  | 0 | 0 |
|  | 0 | 0 |
|  | 0 | 0 |
|  | 0 | 0 |
|  | 0 | 0 |
|  | 0 | 0 |
|  | 0 | 0 |
|  | 0 | 0 |
|  | 0 | 0 |
|  | 0 | 0 |
|  | 0 | 0 |
|  | 0 | 0 |
|  | 0 | 0 |
|  | 0 | 0 |
|  | 0 | 0 |
|  | 0 | 0 |
|  | 0 | 0 |
|  | 0 | 0 |
|  | 0 | 0 |
|  | 0 | 0 |
|  | 0 | 0 |
|  | 0 | 0 |
|  | 0 | 0 |
|  | 0 | 0 |
|  | 0 | 0 |
|  | 0 | 0 |
|  | 0 | 0 |
|  | 0 | 0 |
|  | 0 | 0 |
|  | 0 | 0 |
|  | 0 | 0 |
|  | 0 | 0 |
|  | 0 | 0 |
|  | 0 | 0 |
|  | 0 | 0 |
|  | 0 | 0 |
|  | 0 | 0 |
|  | 0 | 0 |
|  | 0 | 0 |
|  | 0 | 0 |
|  | 0 | 0 |
|  | 0 | 0 |
|  | 0 | 0 |
|  | 0 | 0 |
|  | 0 | 0 |
|  | 0 | 0 |
|  | 0 | 0 |
|  | 0 | 0 |
|  | 0 | 0 |
|  | 0 | 0 |
|  | 0 | 0 |
|  | 0 | 0 |
|  | 0 | 0 |
|  | 0 | 0 |
|  | 0 | 0 |
|  | 0 | 0 |
|  | 0 | 0 |
|  | 0 | 0 |
|  | 0 | 0 |
|  | 0 | 0 |
|  | 0 | 0 |
|  | 0 | 0 |
|  | 0 | 0 |
|  | 0 | 0 |
|  | 0 | 0 |
|  | 0 | 0 |
|  | 0 | 0 |
|  | 0 | 0 |
|  | 0 | 0 |
|  | 0 | 0 |
|  | 0 | 0 |
|  | 0 | 0 |
|  | 0 | 0 |
|  | 0 | 0 |
|  | 0 | 0 |
|  | 0 | 0 |
|  | 0 | 0 |
|  | 0 | 0 |
|  | 0 | 0 |
|  | 0 | 0 |
|  | 0 | 0 |
|  | 0 | 0 |
|  | 0 | 0 |
|  | 0 | 0 |
|  | 0 | 0 |
|  | 0 | 0 |
|  | 0 | 0 |
|  | 0 | 0 |
|  | 0 | 0 |
|  | 0 | 0 |
|  | 0 | 0 |
|  | 0 | 0 |
|  | 0 | 0 |
|  | 0 | 0 |
|  | 0 | 0 |
|  | 0 | 0 |
|  | 0 | 0 |
|  | 0 | 0 |
|  | 0 | 0 |
|  | 0 | 0 |
|  | 0 | 0 |
|  | 0 | 0 |
|  | 0 | 0 |
|  | 0 | 0 |
|  | 0 | 0 |
|  | 0 | 0 |
|  | 0 | 0 |
|  | 0 | 0 |
|  | 0 | 0 |
|  | 0 | 0 |
|  | 0 | 0 |
|  | 0 | 0 |
|  | 0 | 0 |
|  | 0 | 0 |
|  | 0 | 0 |
|  | 0 | 0 |
|  | 0 | 0 |
|  | 0 | 0 |
|  | 0 | 0 |
|  | 0 | 0 |
|  | 0 | 0 |
|  | 0 | 0 |
|  | 0 | 0 |
|  | 0 | 0 |
|  | 0 | 0 |
|  | 0 | 0 |
|  | 0 | 0 |
|  | 0 | 0 |
|  | 0 | 0 |
|  | 0 | 0 |
|  | 0 | 0 |
|  | 0 | 0 |
|  | 0 | 0 |
|  | 0 | 0 |
|  | 0 | 0 |
|  | 0 | 0 |
|  | 0 | 0 |
|  | 0 | 0 |
|  | 0 | 0 |
|  | 0 | 0 |
|  | 0 | 0 |
|  | 0 | 0 |
|  | 0 | 0 |
|  | 0 | 0 |
|  | 0 | 0 |
|  | 0 | 0 |
|  | 0 | 0 |
|  | 0 | 0 |
|  | 0 | 0 |